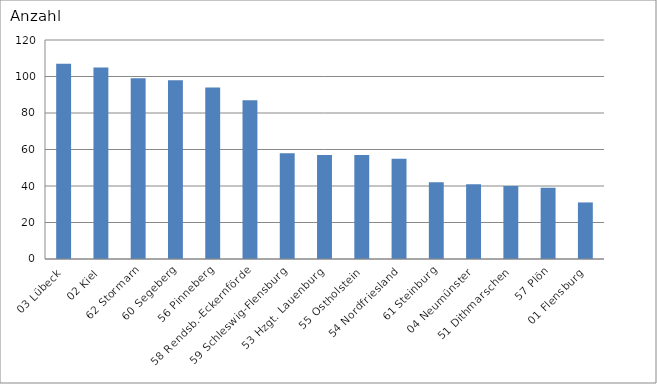
| Category | 03 Lübeck 02 Kiel 62 Stormarn 60 Segeberg 56 Pinneberg 58 Rendsb.-Eckernförde 59 Schleswig-Flensburg 53 Hzgt. Lauenburg 55 Ostholstein 54 Nordfriesland 61 Steinburg 04 Neumünster 51 Dithmarschen 57 Plön 01 Flensburg |
|---|---|
| 03 Lübeck | 107 |
| 02 Kiel | 105 |
| 62 Stormarn | 99 |
| 60 Segeberg | 98 |
| 56 Pinneberg | 94 |
| 58 Rendsb.-Eckernförde | 87 |
| 59 Schleswig-Flensburg | 58 |
| 53 Hzgt. Lauenburg | 57 |
| 55 Ostholstein | 57 |
| 54 Nordfriesland | 55 |
| 61 Steinburg | 42 |
| 04 Neumünster | 41 |
| 51 Dithmarschen | 40 |
| 57 Plön | 39 |
| 01 Flensburg | 31 |